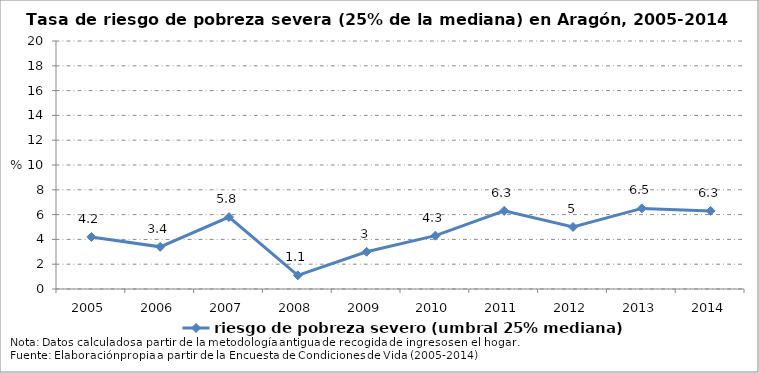
| Category | riesgo de pobreza severo (umbral 25% mediana) |
|---|---|
| 2005.0 | 4.2 |
| 2006.0 | 3.4 |
| 2007.0 | 5.8 |
| 2008.0 | 1.1 |
| 2009.0 | 3 |
| 2010.0 | 4.3 |
| 2011.0 | 6.3 |
| 2012.0 | 5 |
| 2013.0 | 6.5 |
| 2014.0 | 6.3 |